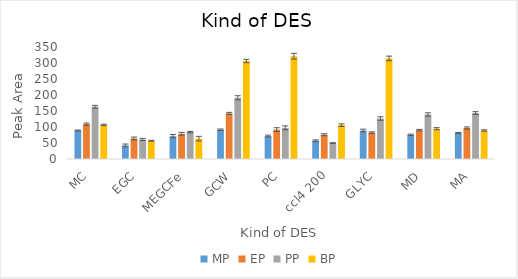
| Category | MP | EP | PP | BP |
|---|---|---|---|---|
|  MC | 89 | 108.81 | 163.31 | 106.65 |
| EGC | 42.48 | 64.18 | 61.07 | 57.07 |
| MEGCFe | 71.43 | 78.75 | 84.09 | 63.57 |
| GCW | 91.52 | 142.41 | 191.36 | 306.16 |
| PC | 71.6 | 91.8 | 97.36 | 321.18 |
| ccl4 200 | 57.3 | 75.91 | 49.82 | 105.78 |
| GLYC | 88.91 | 82.41 | 126.51 | 314.36 |
| MD | 75.54 | 90.12 | 139.19 | 94.76 |
| MA | 81.09 | 96.9 | 143.7 | 89.11 |